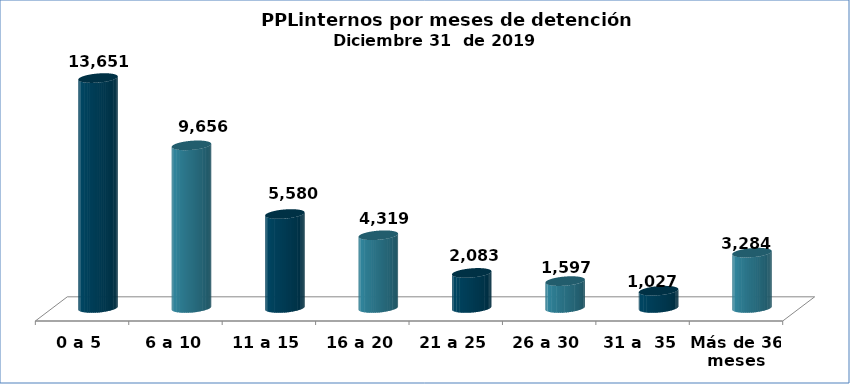
| Category | Series 0 |
|---|---|
| 0 a 5 | 13651 |
| 6 a 10 | 9656 |
| 11 a 15 | 5580 |
| 16 a 20 | 4319 |
| 21 a 25 | 2083 |
| 26 a 30 | 1597 |
| 31 a  35 | 1027 |
| Más de 36 meses | 3284 |